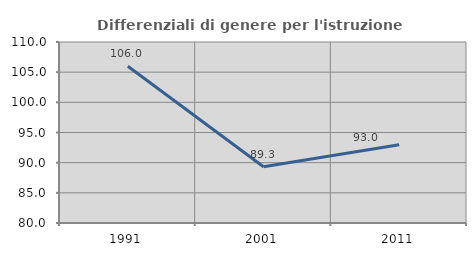
| Category | Differenziali di genere per l'istruzione superiore |
|---|---|
| 1991.0 | 105.983 |
| 2001.0 | 89.334 |
| 2011.0 | 92.958 |